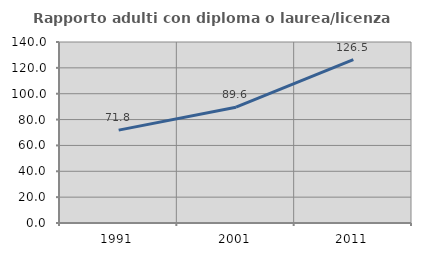
| Category | Rapporto adulti con diploma o laurea/licenza media  |
|---|---|
| 1991.0 | 71.842 |
| 2001.0 | 89.604 |
| 2011.0 | 126.45 |